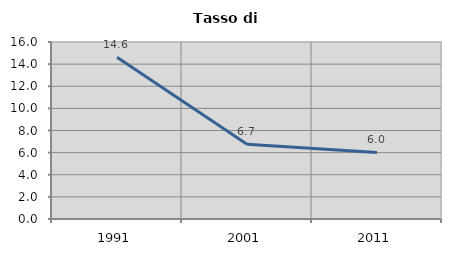
| Category | Tasso di disoccupazione   |
|---|---|
| 1991.0 | 14.62 |
| 2001.0 | 6.749 |
| 2011.0 | 6.014 |